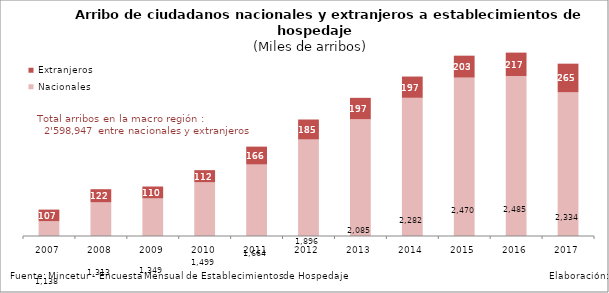
| Category | Nacionales | Extranjeros |
|---|---|---|
| 2007.0 | 1137.653 | 107.397 |
| 2008.0 | 1312.603 | 121.621 |
| 2009.0 | 1349.119 | 110.073 |
| 2010.0 | 1498.775 | 112.219 |
| 2011.0 | 1663.747 | 165.558 |
| 2012.0 | 1895.816 | 185.013 |
| 2013.0 | 2084.581 | 197.301 |
| 2014.0 | 2282.345 | 197.229 |
| 2015.0 | 2470.109 | 202.984 |
| 2016.0 | 2484.72 | 216.903 |
| 2017.0 | 2333.674 | 265.273 |